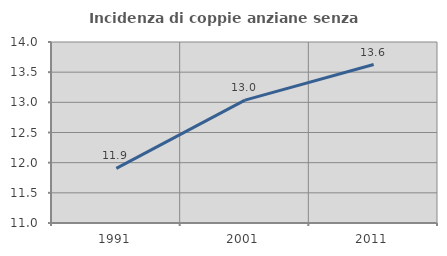
| Category | Incidenza di coppie anziane senza figli  |
|---|---|
| 1991.0 | 11.905 |
| 2001.0 | 13.036 |
| 2011.0 | 13.626 |